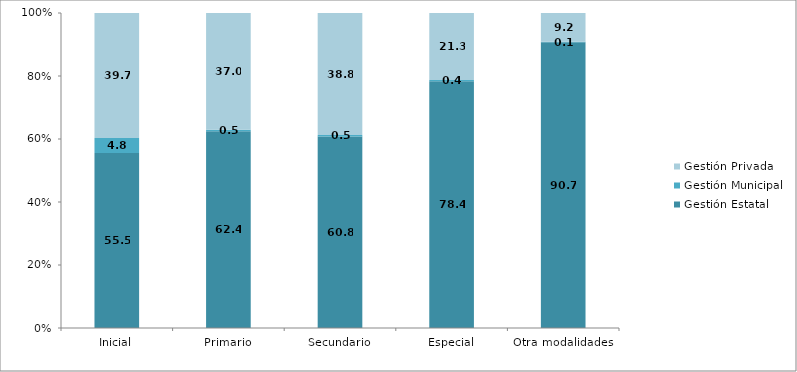
| Category | Gestión Estatal | Gestión Municipal | Gestión Privada |
|---|---|---|---|
| Inicial | 55.545 | 4.794 | 39.661 |
| Primario | 62.436 | 0.516 | 37.048 |
| Secundario | 60.764 | 0.467 | 38.769 |
| Especial | 78.353 | 0.387 | 21.26 |
| Otra modalidades | 90.699 | 0.138 | 9.163 |